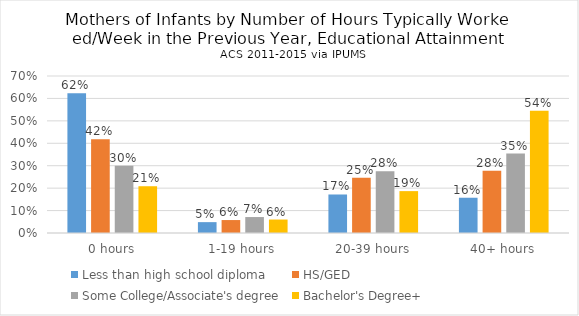
| Category | Less than high school diploma | HS/GED | Some College/Associate's degree | Bachelor's Degree+ |
|---|---|---|---|---|
| 0 hours | 0.623 | 0.418 | 0.3 | 0.209 |
| 1-19 hours | 0.048 | 0.058 | 0.071 | 0.06 |
| 20-39 hours | 0.172 | 0.247 | 0.275 | 0.187 |
| 40+ hours | 0.157 | 0.278 | 0.354 | 0.545 |